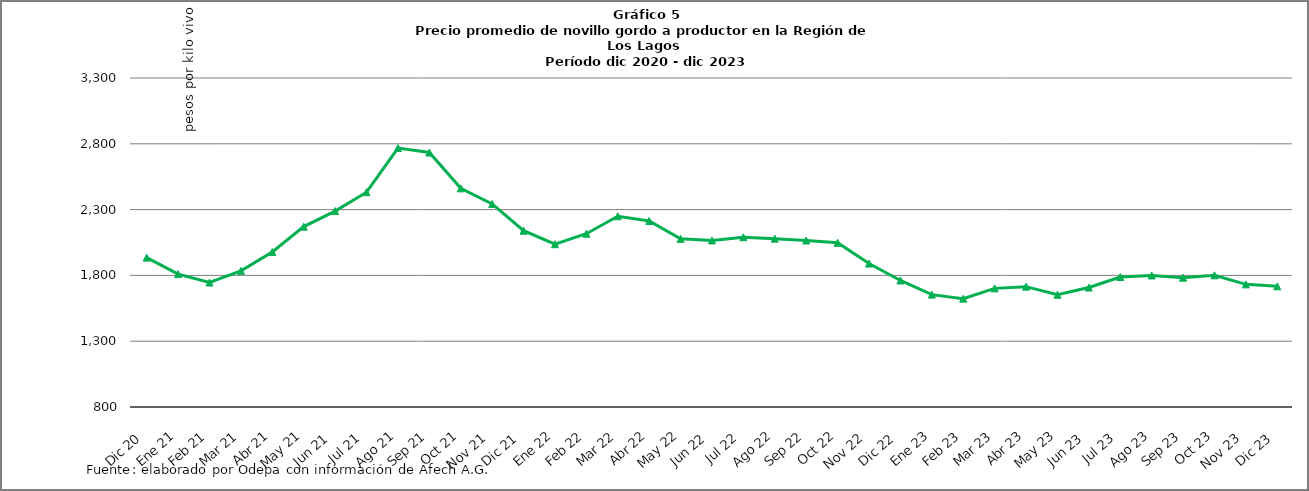
| Category | Series 4 |
|---|---|
| Dic 20 | 1935.07 |
| Ene 21 | 1809.76 |
| Feb 21 | 1745.94 |
| Mar 21 | 1834.7 |
| Abr 21 | 1978.23 |
| May 21 | 2170.49 |
| Jun 21 | 2288.81 |
| Jul 21 | 2432.18 |
| Ago 21 | 2767.95 |
| Sep 21 | 2733.94 |
| Oct 21 | 2461.45 |
| Nov 21 | 2342.7 |
| Dic 21 | 2139.46 |
| Ene 22 | 2037.07 |
| Feb 22 | 2116.65 |
| Mar 22 | 2249.5 |
| Abr 22 | 2213.68 |
| May 22 | 2077.64 |
| Jun 22 | 2065.98 |
| Jul 22 | 2089.87 |
| Ago 22 | 2079.41 |
| Sep 22 | 2065.43 |
| Oct 22 | 2047.82 |
| Nov 22 | 1889.78 |
| Dic 22 | 1761.47 |
| Ene 23 | 1654 |
| Feb 23 | 1623.32 |
| Mar 23 | 1701.42 |
| Abr 23 | 1714.37 |
| May 23 | 1653.09 |
| Jun 23 | 1707.97 |
| Jul 23 | 1787.61 |
| Ago 23 | 1799.8 |
| Sep 23 | 1782.72 |
| Oct 23 | 1800.51 |
| Nov 23 | 1731.99 |
| Dic 23 | 1716.98 |